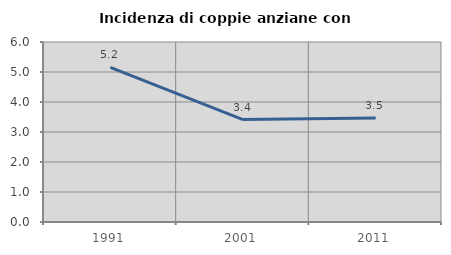
| Category | Incidenza di coppie anziane con figli |
|---|---|
| 1991.0 | 5.153 |
| 2001.0 | 3.415 |
| 2011.0 | 3.464 |